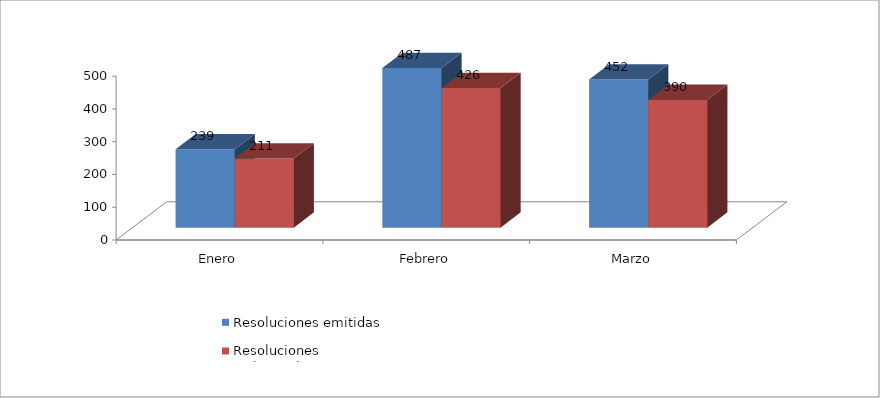
| Category | Resoluciones emitidas | Resoluciones estimatorias |
|---|---|---|
| Enero | 239 | 211 |
| Febrero | 487 | 426 |
| Marzo | 452 | 390 |